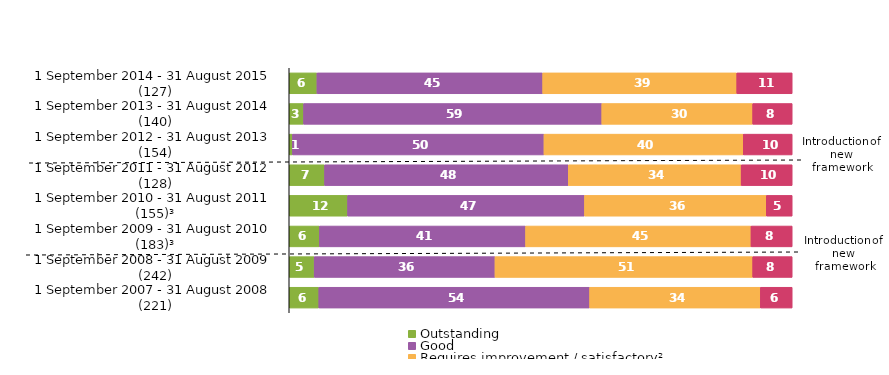
| Category | Outstanding | Good | Requires improvement / satisfactory² | Inadequate |
|---|---|---|---|---|
| 1 September 2014 - 31 August 2015 (127) | 5.512 | 44.882 | 38.583 | 11.024 |
| 1 September 2013 - 31 August 2014 (140) | 2.857 | 59.286 | 30 | 7.857 |
| 1 September 2012 - 31 August 2013 (154) | 0.649 | 50 | 39.61 | 9.74 |
| 1 September 2011 - 31 August 2012 (128) | 7.031 | 48.438 | 34.375 | 10.156 |
| 1 September 2010 - 31 August 2011 (155)³ | 11.613 | 47.097 | 36.129 | 5.161 |
| 1 September 2009 - 31 August 2010 (183)³ | 6.011 | 40.984 | 44.809 | 8.197 |
| 1 September 2008 - 31 August 2009 (242) | 4.959 | 35.95 | 51.24 | 7.851 |
| 1 September 2007 - 31 August 2008 (221) | 5.882 | 53.846 | 33.937 | 6.335 |